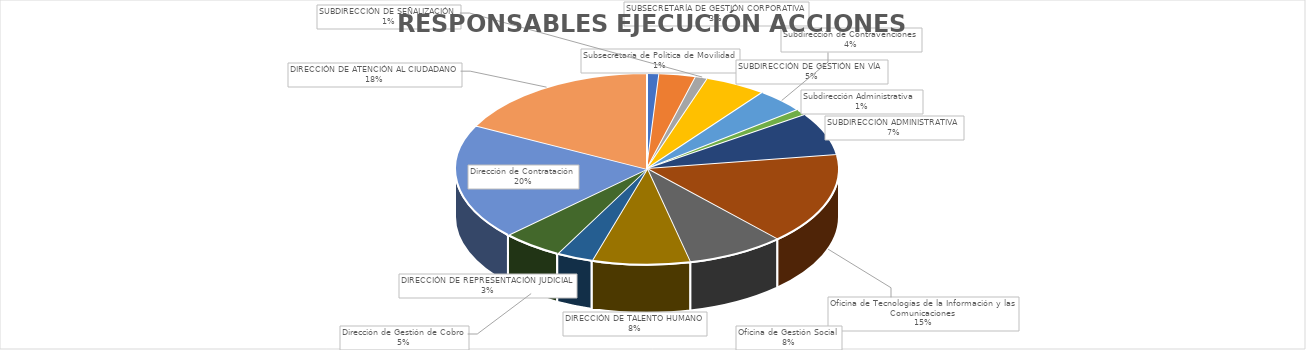
| Category | Total |
|---|---|
| Subsecretaría de Política de Movilidad | 1 |
| SUBSECRETARÍA DE GESTIÓN CORPORATIVA | 3 |
| SUBDIRECCIÓN DE SEÑALIZACIÓN | 1 |
| SUBDIRECCIÓN DE GESTIÓN EN VÍA  | 5 |
| Subdirección de Contravenciones | 4 |
| Subdirección Administrativa  | 1 |
| SUBDIRECCIÓN ADMINISTRATIVA | 7 |
| Oficina de Tecnologías de la Información y las Comunicaciones | 15 |
| Oficina de Gestión Social | 8 |
| DIRECCIÓN DE TALENTO HUMANO | 8 |
| DIRECCIÓN DE REPRESENTACIÓN JUDICIAL | 3 |
| Dirección de Gestión de Cobro | 5 |
| Dirección de Contratación | 19 |
| DIRECCIÓN DE ATENCIÓN AL CIUDADANO | 17 |